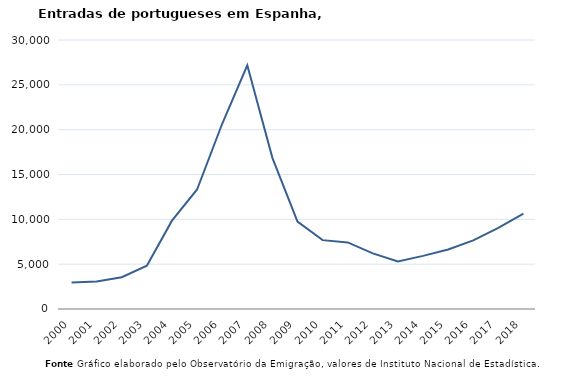
| Category | Entradas |
|---|---|
| 2000.0 | 2968 |
| 2001.0 | 3057 |
| 2002.0 | 3538 |
| 2003.0 | 4825 |
| 2004.0 | 9851 |
| 2005.0 | 13327 |
| 2006.0 | 20658 |
| 2007.0 | 27178 |
| 2008.0 | 16857 |
| 2009.0 | 9739 |
| 2010.0 | 7678 |
| 2011.0 | 7424 |
| 2012.0 | 6201 |
| 2013.0 | 5302 |
| 2014.0 | 5923 |
| 2015.0 | 6638 |
| 2016.0 | 7646 |
| 2017.0 | 9038 |
| 2018.0 | 10636 |